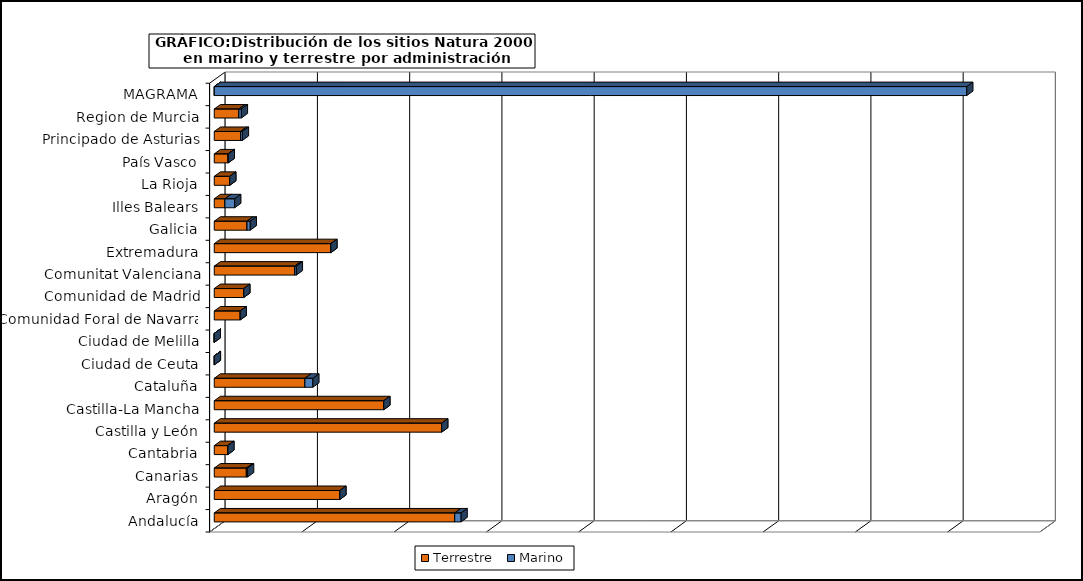
| Category | Terrestre | Marino |
|---|---|---|
| Andalucía | 2606988.946 | 68774.541 |
| Aragón | 1361299.304 | 0 |
| Canarias | 347952.336 | 13358.287 |
| Cantabria | 145807.759 | 1855.459 |
| Castilla y León | 2464998 | 0 |
| Castilla-La Mancha | 1837533.296 | 0 |
| Cataluña | 982693.224 | 85917.431 |
| Ciudad de Ceuta | 630.53 | 836.2 |
| Ciudad de Melilla | 46.119 | 45.461 |
| Comunidad Foral de Navarra | 280949.967 | 0 |
| Comunidad de Madrid | 319553.056 | 0 |
| Comunitat Valenciana | 871795.412 | 17873.356 |
| Extremadura | 1263943.173 | 0 |
| Galicia | 355283.415 | 34569.765 |
| Illes Balears | 115437.065 | 106462.595 |
| La Rioja | 167545.787 | 0 |
| País Vasco | 150391.471 | 1442.935 |
| Principado de Asturias | 285027.072 | 19813.204 |
| Region de Murcia | 266747.568 | 27070.029 |
| MAGRAMA | 526.33 | 8156702.77 |